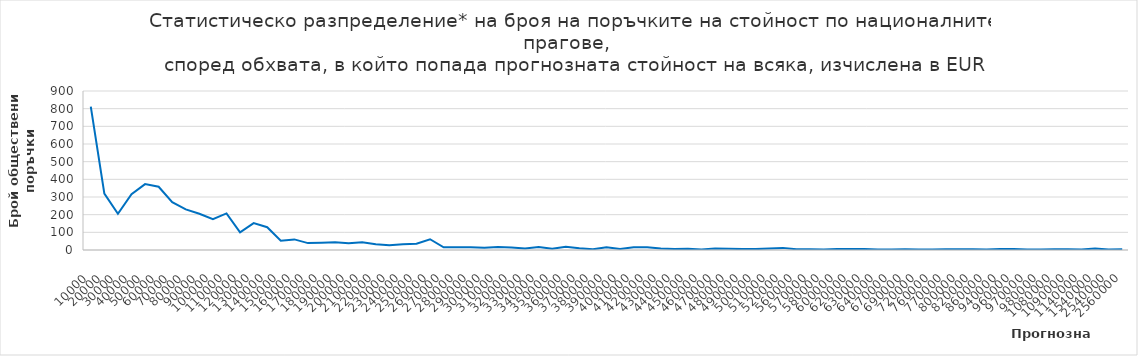
| Category | Series 0 |
|---|---|
| 10000.0 | 812 |
| 20000.0 | 319 |
| 30000.0 | 205 |
| 40000.0 | 316 |
| 50000.0 | 373 |
| 60000.0 | 358 |
| 70000.0 | 271 |
| 80000.0 | 230 |
| 90000.0 | 205 |
| 100000.0 | 174 |
| 110000.0 | 207 |
| 120000.0 | 100 |
| 130000.0 | 152 |
| 140000.0 | 129 |
| 150000.0 | 52 |
| 160000.0 | 60 |
| 170000.0 | 39 |
| 180000.0 | 41 |
| 190000.0 | 44 |
| 200000.0 | 38 |
| 210000.0 | 44 |
| 220000.0 | 33 |
| 230000.0 | 27 |
| 240000.0 | 33 |
| 250000.0 | 35 |
| 260000.0 | 61 |
| 270000.0 | 15 |
| 280000.0 | 15 |
| 290000.0 | 16 |
| 300000.0 | 13 |
| 310000.0 | 17 |
| 320000.0 | 14 |
| 330000.0 | 9 |
| 340000.0 | 17 |
| 350000.0 | 7 |
| 360000.0 | 19 |
| 370000.0 | 10 |
| 380000.0 | 4 |
| 390000.0 | 16 |
| 400000.0 | 6 |
| 410000.0 | 16 |
| 420000.0 | 15 |
| 430000.0 | 8 |
| 440000.0 | 6 |
| 450000.0 | 7 |
| 460000.0 | 3 |
| 470000.0 | 9 |
| 480000.0 | 7 |
| 490000.0 | 5 |
| 500000.0 | 5 |
| 510000.0 | 9 |
| 520000.0 | 12 |
| 560000.0 | 4 |
| 570000.0 | 4 |
| 580000.0 | 3 |
| 600000.0 | 6 |
| 620000.0 | 6 |
| 630000.0 | 6 |
| 640000.0 | 3 |
| 670000.0 | 3 |
| 690000.0 | 4 |
| 720000.0 | 3 |
| 760000.0 | 3 |
| 770000.0 | 4 |
| 800000.0 | 4 |
| 820000.0 | 4 |
| 860000.0 | 3 |
| 940000.0 | 5 |
| 960000.0 | 5 |
| 970000.0 | 3 |
| 980000.0 | 3 |
| 1080000.0 | 4 |
| 1090000.0 | 4 |
| 1140000.0 | 3 |
| 1540000.0 | 8 |
| 2540000.0 | 3 |
| 2560000.0 | 4 |